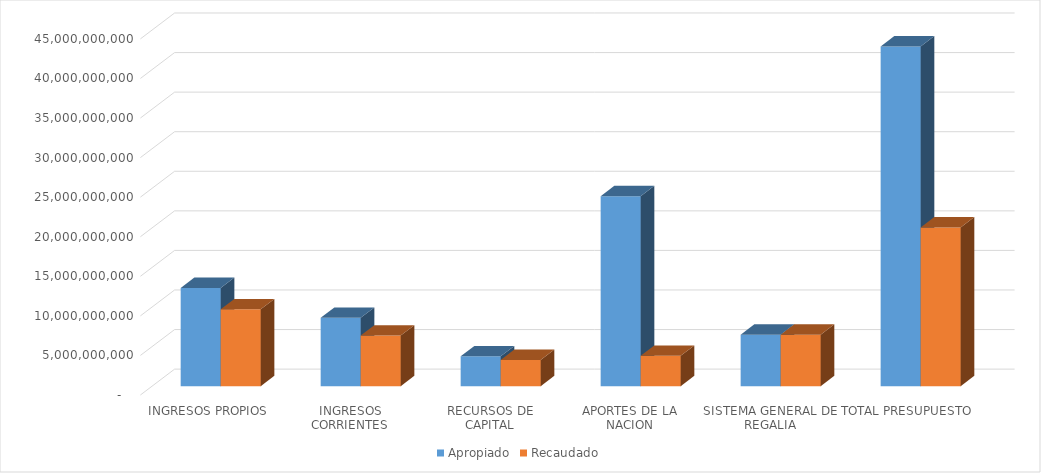
| Category | Apropiado | Recaudado |
|---|---|---|
| INGRESOS PROPIOS | 12421153133 | 9719244440.05 |
| INGRESOS CORRIENTES | 8647756147 | 6399245173 |
| RECURSOS DE CAPITAL | 3773396986 | 3319999267.05 |
| APORTES DE LA NACION | 24013035916 | 3835706810.5 |
| SISTEMA GENERAL DE REGALIA | 6501682816.2 | 6501682816.2 |
| TOTAL PRESUPUESTO  | 42935871865.2 | 20056634066.75 |